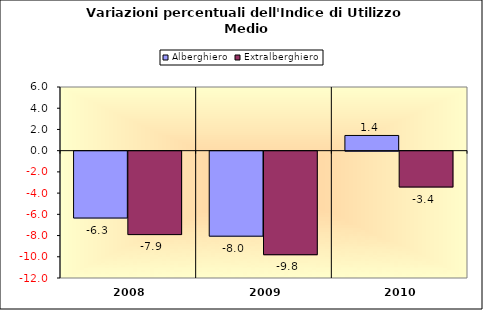
| Category | Alberghiero | Extralberghiero |
|---|---|---|
| 2008.0 | -6.301 | -7.865 |
| 2009.0 | -8.012 | -9.756 |
| 2010.0 | 1.433 | -3.378 |